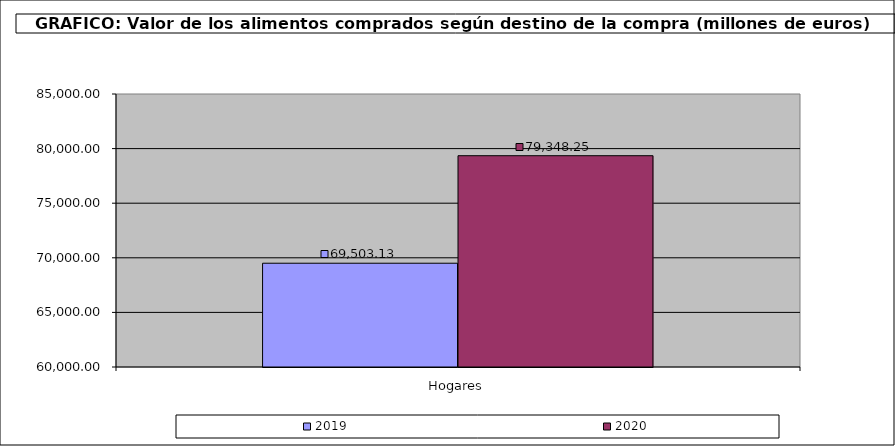
| Category | 2019 | 2020 |
|---|---|---|
| 0 | 69503.13 | 79348.254 |